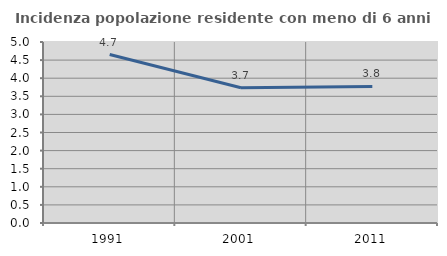
| Category | Incidenza popolazione residente con meno di 6 anni |
|---|---|
| 1991.0 | 4.653 |
| 2001.0 | 3.737 |
| 2011.0 | 3.772 |